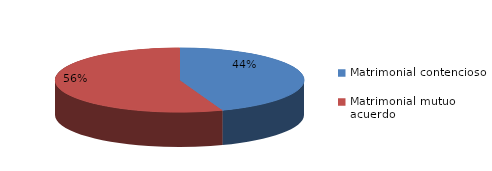
| Category | Series 0 |
|---|---|
| 0 | 568 |
| 1 | 711 |